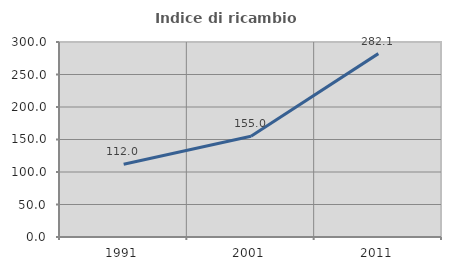
| Category | Indice di ricambio occupazionale  |
|---|---|
| 1991.0 | 112.038 |
| 2001.0 | 155.002 |
| 2011.0 | 282.118 |